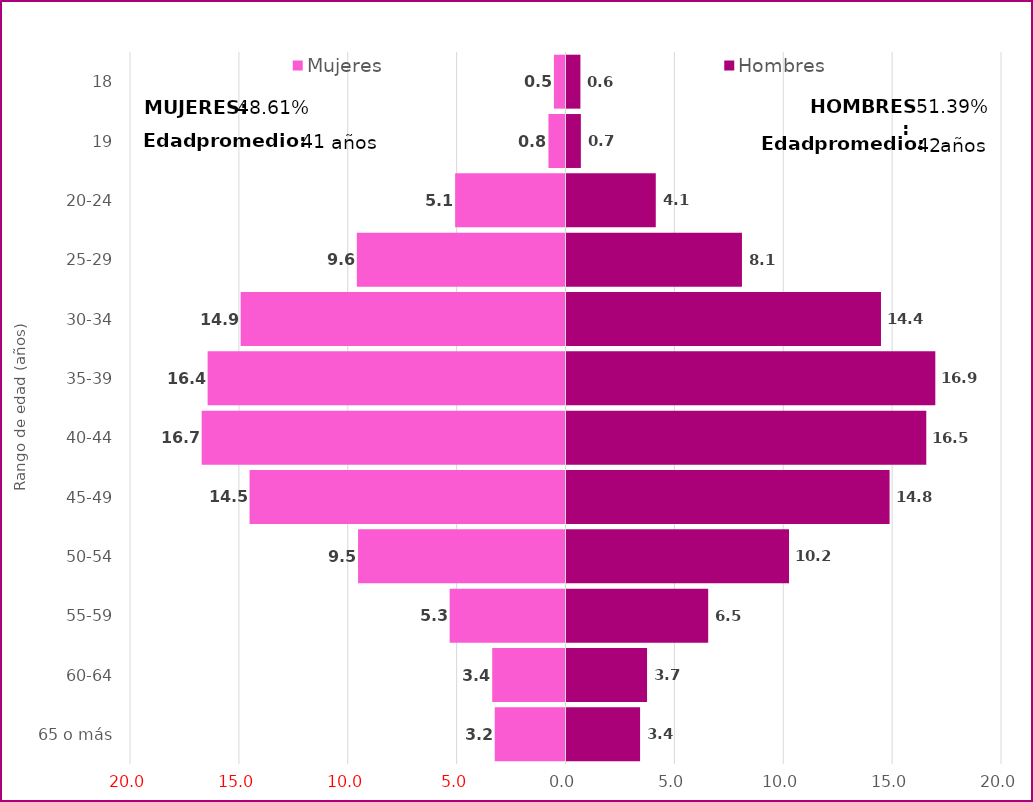
| Category | Mujeres | Hombres |
|---|---|---|
| 18 | -0.532 | 0.639 |
| 19 | -0.784 | 0.66 |
| 20-24 | -5.069 | 4.1 |
| 25-29 | -9.584 | 8.057 |
| 30-34 | -14.918 | 14.442 |
| 35-39 | -16.435 | 16.938 |
| 40-44 | -16.709 | 16.523 |
| 45-49 | -14.509 | 14.836 |
| 50-54 | -9.526 | 10.22 |
| 55-59 | -5.32 | 6.507 |
| 60-64 | -3.365 | 3.699 |
| 65 o más | -3.25 | 3.379 |